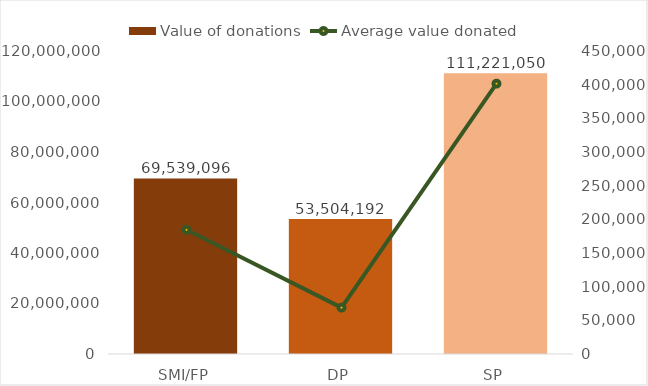
| Category | Value of donations |
|---|---|
| SMI/FP | 69539095.955 |
| DP | 53504191.94 |
| SP | 111221050 |